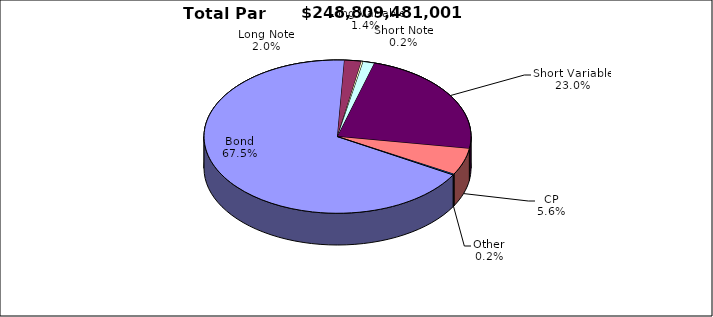
| Category | Par Value |
|---|---|
| Bond | 167963167439 |
| Long Note | 5096125292 |
| Short Note | 535707165 |
| Long Variable | 3456370000 |
| Short Variable | 57290716105 |
| CP | 14017263000 |
| Other | 450132000 |